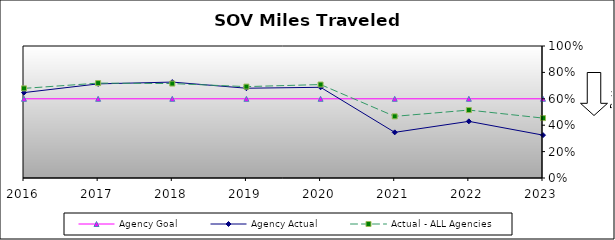
| Category | Agency Goal | Agency Actual | Actual - ALL Agencies |
|---|---|---|---|
| 2016.0 | 0.6 | 0.647 | 0.679 |
| 2017.0 | 0.6 | 0.713 | 0.719 |
| 2018.0 | 0.6 | 0.727 | 0.715 |
| 2019.0 | 0.6 | 0.68 | 0.692 |
| 2020.0 | 0.6 | 0.687 | 0.708 |
| 2021.0 | 0.6 | 0.346 | 0.467 |
| 2022.0 | 0.6 | 0.429 | 0.515 |
| 2023.0 | 0.6 | 0.325 | 0.454 |